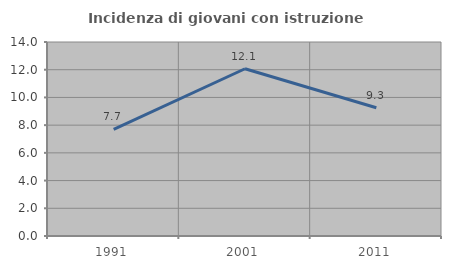
| Category | Incidenza di giovani con istruzione universitaria |
|---|---|
| 1991.0 | 7.692 |
| 2001.0 | 12.069 |
| 2011.0 | 9.259 |